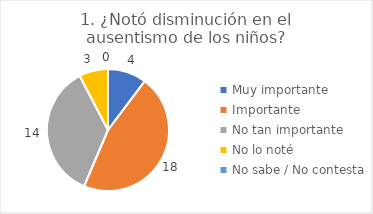
| Category | 1. ¿Notó disminución en el ausentismo de los niños? |
|---|---|
| Muy importante  | 0.103 |
| Importante  | 0.462 |
| No tan importante  | 0.359 |
| No lo noté  | 0.077 |
| No sabe / No contesta | 0 |